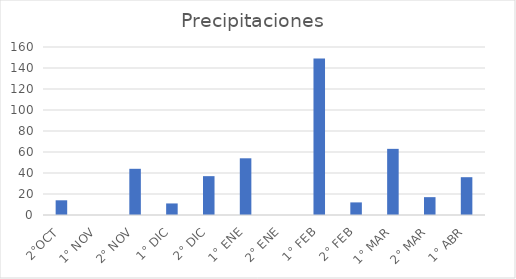
| Category | Precipitaciones  |
|---|---|
| 2°OCT | 14 |
| 1° NOV | 0 |
| 2° NOV | 44 |
| 1° DIC | 11 |
| 2° DIC | 37 |
| 1° ENE | 54 |
| 2° ENE | 0 |
| 1° FEB | 149 |
| 2° FEB | 12 |
| 1° MAR | 63 |
| 2° MAR | 17 |
| 1° ABR | 36 |